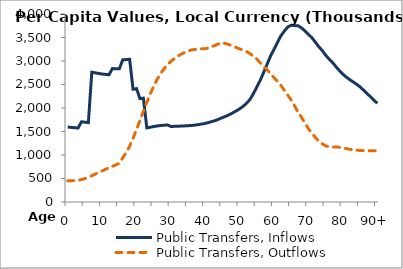
| Category | Public Transfers, Inflows | Public Transfers, Outflows |
|---|---|---|
| 0 | 1594711.389 | 450948.101 |
|  | 1587410.54 | 453573.235 |
| 2 | 1580109.691 | 456198.368 |
| 3 | 1573939.672 | 463163.683 |
| 4 | 1706840.149 | 476922.184 |
| 5 | 1698368.209 | 498674.978 |
| 6 | 1687844.868 | 526292.848 |
| 7 | 2762907.513 | 559036.288 |
| 8 | 2748209.426 | 593598.756 |
| 9 | 2734314.959 | 628082.01 |
| 10 | 2723067.087 | 662179.558 |
| 11 | 2714812.991 | 695518.405 |
| 12 | 2707823.524 | 727335.124 |
| 13 | 2839441.998 | 758869.248 |
| 14 | 2834520.532 | 789792.717 |
| 15 | 2833068.93 | 820739.645 |
| 16 | 3024776.729 | 943499.849 |
| 17 | 3029537.484 | 1050467.581 |
| 18 | 3036851.269 | 1188024.223 |
| 19 | 2399500.96 | 1354761.678 |
| 20 | 2412255.76 | 1541512.059 |
| 21 | 2199374.136 | 1733766.758 |
| 22 | 2210537.403 | 1929423.791 |
| 23 | 1576907.934 | 2121441.328 |
| 24 | 1589950.757 | 2300496.064 |
| 25 | 1605941.469 | 2463454.382 |
| 26 | 1617578.424 | 2609734.481 |
| 27 | 1627443.745 | 2733379.97 |
| 28 | 1634011.913 | 2834631.934 |
| 29 | 1639423.518 | 2921600.11 |
| 30 | 1607323.318 | 2994228.595 |
| 31 | 1609271.041 | 3050138.167 |
| 32 | 1612980.247 | 3105516.146 |
| 33 | 1615297.896 | 3144128.063 |
| 34 | 1619002.993 | 3180733.935 |
| 35 | 1623568.258 | 3212440.197 |
| 36 | 1628159.795 | 3237827.31 |
| 37 | 1635831.095 | 3244598.99 |
| 38 | 1646577.316 | 3259071.446 |
| 39 | 1659241.072 | 3259585.512 |
| 40 | 1672816.282 | 3262743.803 |
| 41 | 1692523.8 | 3279308.991 |
| 42 | 1712968.205 | 3308481.035 |
| 43 | 1734737.304 | 3337815.903 |
| 44 | 1765336.662 | 3369173.649 |
| 45 | 1795004.765 | 3383244.639 |
| 46 | 1825891.124 | 3369500.055 |
| 47 | 1858161.627 | 3345795.823 |
| 48 | 1897393.515 | 3321830.932 |
| 49 | 1938150.158 | 3287737.045 |
| 50 | 1982930.112 | 3256509.593 |
| 51 | 2035289.436 | 3232808.46 |
| 52 | 2100589.841 | 3202040.376 |
| 53 | 2183541.593 | 3154353.692 |
| 54 | 2307544.53 | 3101736.626 |
| 55 | 2448827.799 | 3038245.87 |
| 56 | 2593986.38 | 2961123.825 |
| 57 | 2763056.327 | 2884358.826 |
| 58 | 2937575.192 | 2809891.884 |
| 59 | 3111834.454 | 2727012.033 |
| 60 | 3250973.057 | 2643227.373 |
| 61 | 3398685.665 | 2566423.327 |
| 62 | 3539881.192 | 2479769.378 |
| 63 | 3637943.689 | 2375197.249 |
| 64 | 3725657.515 | 2271476.138 |
| 65 | 3761374.634 | 2164848.589 |
| 66 | 3752903.252 | 2038329.084 |
| 67 | 3750234.857 | 1910774.72 |
| 68 | 3701575.12 | 1799805.781 |
| 69 | 3639636.347 | 1675990.18 |
| 70 | 3566397.327 | 1559566.173 |
| 71 | 3493773.568 | 1461881.307 |
| 72 | 3401200.583 | 1375747.528 |
| 73 | 3304100.941 | 1290269.722 |
| 74 | 3222347.615 | 1238887.005 |
| 75 | 3122768.092 | 1193526.389 |
| 76 | 3041317.748 | 1177601.07 |
| 77 | 2968754.662 | 1168284.55 |
| 78 | 2877278.089 | 1170846.904 |
| 79 | 2794750.157 | 1165048.225 |
| 80 | 2720260.752 | 1149272.801 |
| 81 | 2656193.437 | 1136074.598 |
| 82 | 2602233.72 | 1121861.956 |
| 83 | 2553856.124 | 1109180.734 |
| 84 | 2504302.397 | 1101141.554 |
| 85 | 2450070.167 | 1097022.393 |
| 86 | 2380546.129 | 1092407.636 |
| 87 | 2308969.659 | 1090756.287 |
| 88 | 2240395.647 | 1090059.95 |
| 89 | 2169433.059 | 1090359.834 |
| 90+ | 2098470.471 | 1090802.795 |